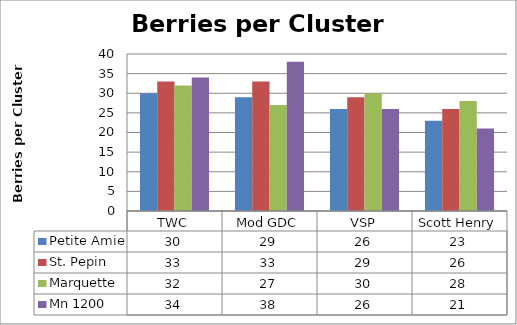
| Category | Petite Amie | St. Pepin | Marquette | Mn 1200 |
|---|---|---|---|---|
| 0 | 30 | 33 | 32 | 34 |
| 1 | 29 | 33 | 27 | 38 |
| 2 | 26 | 29 | 30 | 26 |
| 3 | 23 | 26 | 28 | 21 |